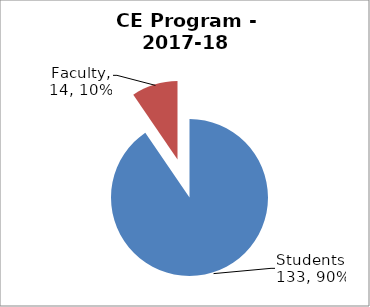
| Category | Series 0 |
|---|---|
| Students | 133 |
| Faculty | 14 |